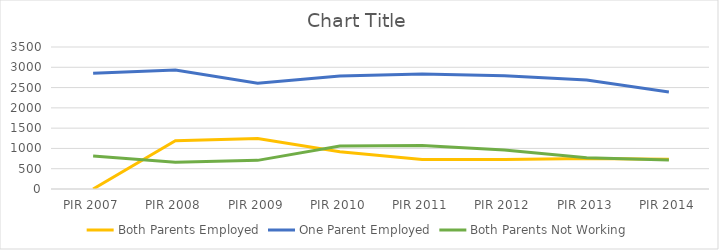
| Category | Both Parents Employed | One Parent Employed | Both Parents Not Working |
|---|---|---|---|
| PIR 2007 | 0 | 2852 | 812 |
| PIR 2008 | 1191 | 2934 | 657 |
| PIR 2009 | 1244 | 2607 | 706 |
| PIR 2010 | 917 | 2785 | 1057 |
| PIR 2011 | 728 | 2833 | 1070 |
| PIR 2012 | 729 | 2789 | 964 |
| PIR 2013 | 753 | 2684 | 773 |
| PIR 2014 | 732 | 2389 | 714 |